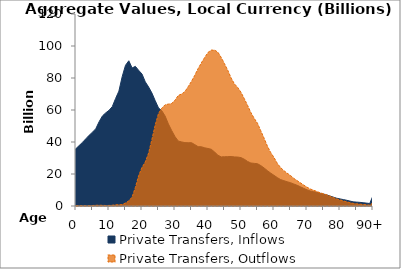
| Category | Private Transfers, Inflows | Private Transfers, Outflows |
|---|---|---|
| 0 | 35880.403 | 128.941 |
|  | 37879.007 | 162.695 |
| 2 | 39847.267 | 126.321 |
| 3 | 42043.793 | 68.022 |
| 4 | 44247.487 | 135.87 |
| 5 | 46122.854 | 309.114 |
| 6 | 48323.396 | 440.163 |
| 7 | 52639.195 | 484.137 |
| 8 | 56258.444 | 418.046 |
| 9 | 58205.56 | 317.786 |
| 10 | 59782.736 | 348.234 |
| 11 | 62133.872 | 489.111 |
| 12 | 67196.118 | 736.66 |
| 13 | 71810.924 | 781.901 |
| 14 | 80858.528 | 900.051 |
| 15 | 87937.35 | 1878.789 |
| 16 | 90778.585 | 3183.27 |
| 17 | 86262.609 | 5585.847 |
| 18 | 87272.811 | 11651.452 |
| 19 | 84764.54 | 19040.434 |
| 20 | 82476.663 | 24079.889 |
| 21 | 77570.278 | 27526.567 |
| 22 | 74381.327 | 33091.05 |
| 23 | 70609.032 | 41656.555 |
| 24 | 65848.696 | 50586.854 |
| 25 | 61310.803 | 57801.847 |
| 26 | 59522.335 | 61159.304 |
| 27 | 56248.24 | 63256.604 |
| 28 | 51281.674 | 63700.934 |
| 29 | 47143.281 | 64072.774 |
| 30 | 43363.97 | 66125.411 |
| 31 | 40572.977 | 69103.425 |
| 32 | 40049.514 | 69970.171 |
| 33 | 39616.577 | 71496.891 |
| 34 | 39535.628 | 74618.036 |
| 35 | 39582.013 | 77936.684 |
| 36 | 38361.61 | 81725.031 |
| 37 | 37080.21 | 85887.985 |
| 38 | 37018.56 | 89493.839 |
| 39 | 36377.024 | 92837.255 |
| 40 | 35939.386 | 95972.573 |
| 41 | 35449.881 | 97434.766 |
| 42 | 33721.828 | 97429.189 |
| 43 | 31780.437 | 96120.592 |
| 44 | 30672.785 | 92860.385 |
| 45 | 30791.713 | 88917.418 |
| 46 | 30854.51 | 84797.523 |
| 47 | 30932.942 | 80028.459 |
| 48 | 30682.423 | 76363.927 |
| 49 | 30601.109 | 74064.743 |
| 50 | 30238.171 | 71076.733 |
| 51 | 29247.699 | 67086.059 |
| 52 | 27841.893 | 62846.304 |
| 53 | 26867.51 | 58413.963 |
| 54 | 26646.971 | 54787.254 |
| 55 | 26429.471 | 51703.28 |
| 56 | 25271.61 | 46980.304 |
| 57 | 23764.953 | 42368.295 |
| 58 | 22098.385 | 37407.295 |
| 59 | 20558.013 | 33449.182 |
| 60 | 19154.718 | 30303.874 |
| 61 | 17761.693 | 26673.212 |
| 62 | 16515.354 | 24021.33 |
| 63 | 15814.84 | 22078.219 |
| 64 | 15152.263 | 20484.023 |
| 65 | 14572.191 | 19036.25 |
| 66 | 13752.007 | 17284.191 |
| 67 | 12966.448 | 15870.516 |
| 68 | 12020.431 | 14521.006 |
| 69 | 11049.971 | 13108.726 |
| 70 | 10110.74 | 11766.868 |
| 71 | 9362.946 | 10615.161 |
| 72 | 8983.448 | 9871.433 |
| 73 | 8524.892 | 9048.403 |
| 74 | 7921.329 | 8272.426 |
| 75 | 7469.756 | 7643.204 |
| 76 | 6925.284 | 6965.283 |
| 77 | 6202.561 | 6104.095 |
| 78 | 5529.645 | 5287.001 |
| 79 | 4860.351 | 4443.322 |
| 80 | 4433.194 | 3795.058 |
| 81 | 4007.573 | 3198.868 |
| 82 | 3594.719 | 2665.677 |
| 83 | 3091.791 | 2115.547 |
| 84 | 2609.629 | 1637.568 |
| 85 | 2432.989 | 1393.55 |
| 86 | 2276.29 | 1182.706 |
| 87 | 2041.618 | 957.465 |
| 88 | 1816.808 | 759.845 |
| 89 | 1537.222 | 566.856 |
| 90+ | 6413.297 | 2055.695 |